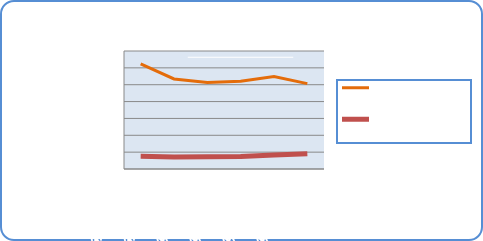
| Category | Motorin Türleri | Benzin Türleri |
|---|---|---|
| 4/8/19 | 62422796.451 | 7565759.936 |
| 4/9/19 | 53410592.837 | 7191055.903 |
| 4/10/19 | 51323684.03 | 7220970.686 |
| 4/11/19 | 52123118.316 | 7408569.215 |
| 4/12/19 | 54900162.384 | 8255941.307 |
| 4/13/19 | 50652446.304 | 9063644.825 |